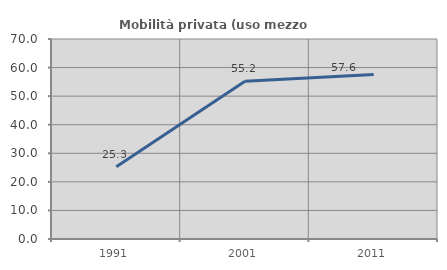
| Category | Mobilità privata (uso mezzo privato) |
|---|---|
| 1991.0 | 25.275 |
| 2001.0 | 55.172 |
| 2011.0 | 57.576 |